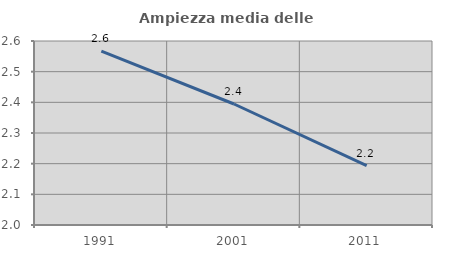
| Category | Ampiezza media delle famiglie |
|---|---|
| 1991.0 | 2.567 |
| 2001.0 | 2.395 |
| 2011.0 | 2.193 |